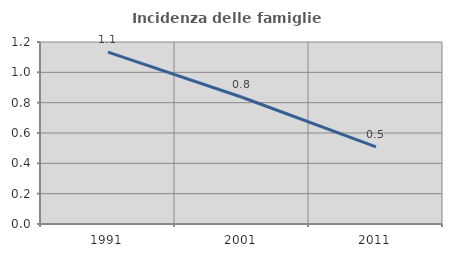
| Category | Incidenza delle famiglie numerose |
|---|---|
| 1991.0 | 1.133 |
| 2001.0 | 0.836 |
| 2011.0 | 0.509 |